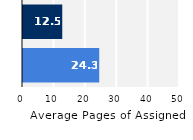
| Category | Series 0 |
|---|---|
| Upper Division | 24.279 |
| Lower Division | 12.5 |